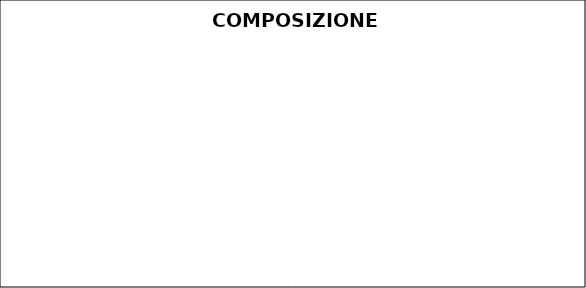
| Category | Series 0 |
|---|---|
| Italiani | 0 |
| Stranieri | 0 |